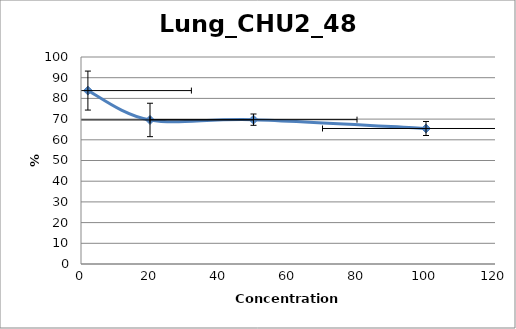
| Category | Lung_CHU2 |
|---|---|
| 100.0 | 65.462 |
| 50.0 | 69.728 |
| 20.0 | 69.591 |
| 2.0 | 83.777 |
| nan | 0 |
| nan | 0 |
| nan | 0 |
| nan | 0 |
| nan | 0 |